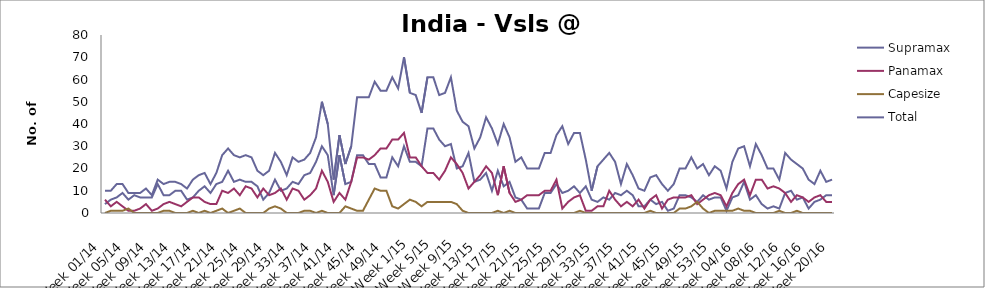
| Category | Supramax | Panamax | Capesize | Total |
|---|---|---|---|---|
| Week 01/14 | 4 | 6 | 0 | 10 |
| Week 02/14 | 6 | 3 | 1 | 10 |
| Week 03/14 | 7 | 5 | 1 | 13 |
| Week 04/14 | 9 | 3 | 1 | 13 |
| Week 05/14 | 6 | 1 | 2 | 9 |
| Week 06/14 | 8 | 1 | 0 | 9 |
| Week 07/14 | 7 | 2 | 0 | 9 |
| Week 08/14 | 7 | 4 | 0 | 11 |
| Week 09/14 | 7 | 1 | 0 | 8 |
| Week 10/14 | 13 | 2 | 0 | 15 |
| Week 11/14 | 8 | 4 | 1 | 13 |
| Week 12/14 | 8 | 5 | 1 | 14 |
| Week 13/14 | 10 | 4 | 0 | 14 |
| Week 14/14 | 10 | 3 | 0 | 13 |
| Week 15/14 | 6 | 5 | 0 | 11 |
| Week 16/14 | 7 | 7 | 1 | 15 |
| Week 17/14 | 10 | 7 | 0 | 17 |
| Week 18/14 | 12 | 5 | 1 | 18 |
| Week 19/14 | 9 | 4 | 0 | 13 |
| Week 20/14 | 13 | 4 | 1 | 18 |
| Week 21/14 | 14 | 10 | 2 | 26 |
| Week 22/14 | 19 | 9 | 0 | 29 |
| Week 23/14 | 14 | 11 | 1 | 26 |
| Week 24/14 | 15 | 8 | 2 | 25 |
| Week 25/14 | 14 | 12 | 0 | 26 |
| Week 26/14 | 14 | 11 | 0 | 25 |
| Week 27/14 | 12 | 7 | 0 | 19 |
| Week 28/14 | 6 | 11 | 0 | 17 |
| Week 29/14 | 9 | 8 | 2 | 19 |
| Week 30/14 | 15 | 9 | 3 | 27 |
| Week 31/14 | 10 | 11 | 2 | 23 |
| Week 32/14 | 11 | 6 | 0 | 17 |
| Week 33/14 | 14 | 11 | 0 | 25 |
| Week 34/14 | 13 | 10 | 0 | 23 |
| Week 35/14 | 17 | 6 | 1 | 24 |
| Week 36/14 | 18 | 8 | 1 | 27 |
| Week 37/14 | 23 | 11 | 0 | 34 |
| Week 38/14 | 30 | 19 | 1 | 50 |
| Week 39/14 | 26 | 14 | 0 | 40 |
| Week 40/14 | 8 | 5 | 0 | 15 |
| Week 41/14 | 26 | 9 | 0 | 35 |
| Week 42/14 | 13 | 6 | 3 | 22 |
| Week 43/14 | 14 | 14 | 2 | 30 |
| Week 44/14 | 26 | 25 | 1 | 52 |
| Week 45/14 | 26 | 25 | 1 | 52 |
| Week 46/14 | 22 | 24 | 6 | 52 |
| Week 47/14 | 22 | 26 | 11 | 59 |
| Week 48/14 | 16 | 29 | 10 | 55 |
| Week 49/14 | 16 | 29 | 10 | 55 |
| Week 50/14 | 25 | 33 | 3 | 61 |
| Week 51/14 | 21 | 33 | 2 | 56 |
| Week 52/14 | 30 | 36 | 4 | 70 |
| Week 1/15 | 23 | 25 | 6 | 54 |
| Week 2/15 | 23 | 25 | 5 | 53 |
| Week 3/15 | 21 | 21 | 3 | 45 |
| Week 4/15 | 38 | 18 | 5 | 61 |
| Week 5/15 | 38 | 18 | 5 | 61 |
| Week 6/15 | 33 | 15 | 5 | 53 |
| Week 7/15 | 30 | 19 | 5 | 54 |
| Week 8/15 | 31 | 25 | 5 | 61 |
| Week 9/15 | 20 | 22 | 4 | 46 |
| Week 10/15 | 21 | 18 | 1 | 41 |
| Week 11/15 | 27 | 11 | 0 | 39 |
| Week 12/15 | 14 | 14 | 0 | 29 |
| Week 13/15 | 15 | 17 | 0 | 34 |
| Week 14/15 | 18 | 21 | 0 | 43 |
| Week 15/15 | 10 | 18 | 0 | 38 |
| Week 16/15 | 19 | 8 | 1 | 31 |
| Week 17/15 | 12 | 21 | 0 | 40 |
| Week 18/15 | 14 | 9 | 1 | 34 |
| Week 19/15 | 7 | 5 | 0 | 23 |
| Week 20/15 | 6 | 6 | 0 | 25 |
| Week 21/15 | 2 | 8 | 0 | 20 |
| Week 22/15 | 2 | 8 | 0 | 20 |
| Week 23/15 | 2 | 8 | 0 | 20 |
| Week 24/15 | 9 | 10 | 0 | 27 |
| Week 25/15 | 9 | 10 | 0 | 27 |
| Week 26/15 | 13 | 15 | 0 | 35 |
| Week 27/15 | 9 | 2 | 0 | 39 |
| Week 28/15 | 10 | 5 | 0 | 31 |
| Week 29/15 | 12 | 7 | 0 | 36 |
| Week 30/15 | 9 | 8 | 1 | 36 |
| Week 31/15 | 12 | 1 | 0 | 24 |
| Week 32/15 | 6 | 1 | 0 | 10 |
| Week 33/15 | 5 | 3 | 0 | 21 |
| Week 34/15 | 7 | 3 | 0 | 24 |
| Week 35/15 | 6 | 10 | 0 | 27 |
| Week 36/15 | 9 | 6 | 0 | 23 |
| Week 37/15 | 8 | 3 | 0 | 13 |
| Week 38/15 | 10 | 5 | 0 | 22 |
| Week 39/15 | 8 | 3 | 0 | 17 |
| Week 40/15 | 3 | 6 | 0 | 11 |
| Week 41/15 | 3 | 2 | 0 | 10 |
| Week 42/15 | 6 | 6 | 1 | 16 |
| Week 43/15 | 4 | 8 | 0 | 17 |
| Week 44/15 | 5 | 2 | 0 | 13 |
| Week 45/15 | 1 | 6 | 0 | 10 |
| Week 46/15 | 2 | 7 | 0 | 13 |
| Week 47/15 | 8 | 7 | 2 | 20 |
| Week 48/15 | 8 | 7 | 2 | 20 |
| Week 49/15 | 7 | 8 | 3 | 25 |
| Week 50/15 | 5 | 4 | 5 | 20 |
| Week 51/15 | 8 | 6 | 2 | 22 |
| Week 52/15 | 6 | 8 | 0 | 17 |
| Week 53/15 | 7 | 9 | 1 | 21 |
| Week 01/16 | 7 | 8 | 1 | 19 |
| Week 02/16 | 1 | 3 | 1 | 11 |
| Week 03/16 | 7 | 9 | 1 | 23 |
| Week 04/16 | 8 | 13 | 2 | 29 |
| Week 05/16 | 14 | 15 | 1 | 30 |
| Week 06/16 | 6 | 8 | 1 | 21 |
| Week 07/16 | 8 | 15 | 0 | 31 |
| Week 08/16 | 4 | 15 | 0 | 26 |
| Week 09/16 | 2 | 11 | 0 | 20 |
| Week 10/16 | 3 | 12 | 0 | 20 |
| Week 11/16 | 2 | 11 | 1 | 15 |
| Week 12/16 | 9 | 9 | 0 | 27 |
| Week 13/16 | 10 | 5 | 0 | 24 |
| Week 14/16 | 6 | 8 | 1 | 22 |
| Week 15/16 | 7 | 7 | 0 | 20 |
| Week 16/16 | 2 | 5 | 0 | 15 |
| Week 17/16 | 5 | 7 | 0 | 13 |
| Week 18/16 | 6 | 8 | 0 | 19 |
| Week 19/16 | 8 | 5 | 0 | 14 |
| Week 20/16 | 8 | 5 | 0 | 15 |